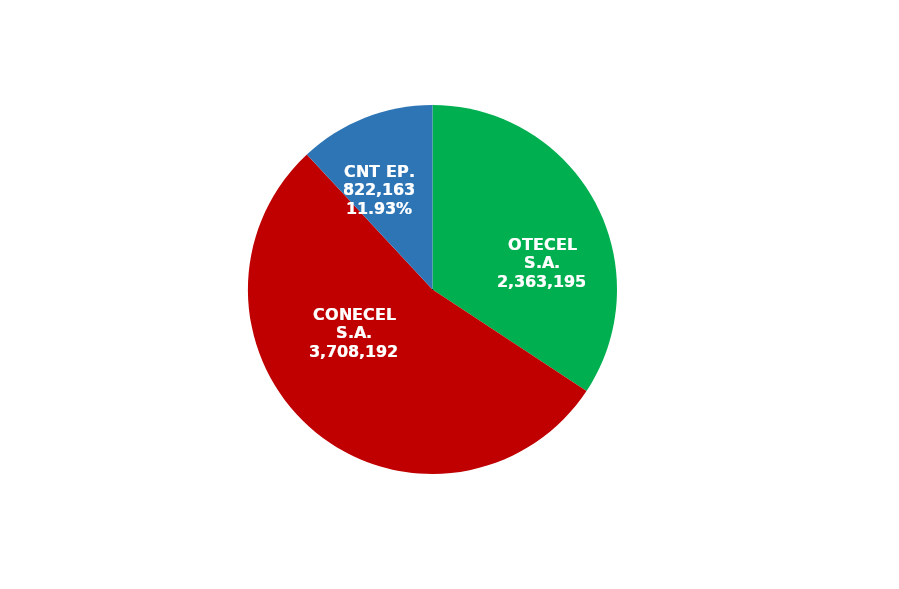
| Category | Series 0 |
|---|---|
| OTECEL S.A. | 2363195 |
| CONECEL S.A. | 3708192 |
| CNT EP. | 822163 |